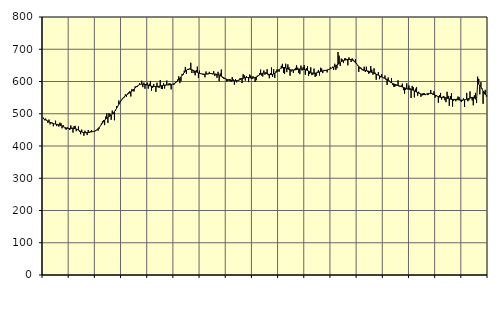
| Category | Piggar | Series 1 |
|---|---|---|
| nan | 487.8 | 483.77 |
| 87.0 | 479.9 | 482.5 |
| 87.0 | 484.9 | 480.74 |
| 87.0 | 479.7 | 478.95 |
| 87.0 | 471.6 | 477.12 |
| 87.0 | 481.9 | 475.35 |
| 87.0 | 467.1 | 473.54 |
| 87.0 | 474.1 | 471.96 |
| 87.0 | 472.4 | 470.56 |
| 87.0 | 461.1 | 469.45 |
| 87.0 | 468.9 | 468.63 |
| 87.0 | 478.5 | 467.98 |
| nan | 461.8 | 467.37 |
| 88.0 | 464.8 | 466.69 |
| 88.0 | 460.1 | 465.79 |
| 88.0 | 472.4 | 464.59 |
| 88.0 | 470.7 | 463.21 |
| 88.0 | 454.8 | 461.67 |
| 88.0 | 465.1 | 460 |
| 88.0 | 458.6 | 458.4 |
| 88.0 | 451.8 | 456.98 |
| 88.0 | 451.5 | 455.83 |
| 88.0 | 457.6 | 455.02 |
| 88.0 | 452.9 | 454.59 |
| nan | 449.6 | 454.45 |
| 89.0 | 463.9 | 454.56 |
| 89.0 | 457 | 454.75 |
| 89.0 | 441.5 | 454.8 |
| 89.0 | 461.3 | 454.48 |
| 89.0 | 462.5 | 453.77 |
| 89.0 | 445.8 | 452.63 |
| 89.0 | 449.8 | 451.09 |
| 89.0 | 460.6 | 449.28 |
| 89.0 | 444.2 | 447.36 |
| 89.0 | 436.6 | 445.49 |
| 89.0 | 450.9 | 443.82 |
| nan | 441.8 | 442.53 |
| 90.0 | 431.7 | 441.68 |
| 90.0 | 447.4 | 441.26 |
| 90.0 | 442 | 441.31 |
| 90.0 | 433.9 | 441.71 |
| 90.0 | 449.6 | 442.27 |
| 90.0 | 441 | 442.86 |
| 90.0 | 445.4 | 443.41 |
| 90.0 | 449.2 | 443.88 |
| 90.0 | 443.3 | 444.45 |
| 90.0 | 444.7 | 445.29 |
| 90.0 | 445.3 | 446.47 |
| nan | 446.8 | 448.2 |
| 91.0 | 451.3 | 450.61 |
| 91.0 | 447.6 | 453.69 |
| 91.0 | 453.5 | 457.44 |
| 91.0 | 461.6 | 461.73 |
| 91.0 | 470.1 | 466.32 |
| 91.0 | 476.5 | 471.04 |
| 91.0 | 479.9 | 475.7 |
| 91.0 | 464.7 | 479.96 |
| 91.0 | 491.2 | 483.64 |
| 91.0 | 501.6 | 486.65 |
| 91.0 | 471.5 | 489.08 |
| nan | 502.3 | 491.18 |
| 92.0 | 499.1 | 493.25 |
| 92.0 | 481.2 | 495.6 |
| 92.0 | 509.7 | 498.53 |
| 92.0 | 500 | 502.13 |
| 92.0 | 479.8 | 506.47 |
| 92.0 | 508.6 | 511.49 |
| 92.0 | 523.9 | 517.05 |
| 92.0 | 522.5 | 522.94 |
| 92.0 | 541.2 | 528.98 |
| 92.0 | 533.6 | 534.78 |
| 92.0 | 538.9 | 540.17 |
| nan | 546.3 | 545.03 |
| 93.0 | 548.2 | 549.17 |
| 93.0 | 550.4 | 552.62 |
| 93.0 | 560.4 | 555.52 |
| 93.0 | 552.9 | 558 |
| 93.0 | 562.6 | 560.32 |
| 93.0 | 566.1 | 562.69 |
| 93.0 | 570.2 | 565.06 |
| 93.0 | 553.6 | 567.57 |
| 93.0 | 576.8 | 570.29 |
| 93.0 | 570.1 | 573.28 |
| 93.0 | 569.1 | 576.55 |
| nan | 584.6 | 579.88 |
| 94.0 | 585.2 | 583.12 |
| 94.0 | 583.2 | 586.07 |
| 94.0 | 589.1 | 588.45 |
| 94.0 | 594.7 | 590.23 |
| 94.0 | 592.2 | 591.41 |
| 94.0 | 602.4 | 591.94 |
| 94.0 | 582.6 | 591.91 |
| 94.0 | 596.7 | 591.52 |
| 94.0 | 577.6 | 590.89 |
| 94.0 | 591.8 | 590.05 |
| 94.0 | 596.8 | 589.17 |
| nan | 577.9 | 588.19 |
| 95.0 | 593.1 | 587.18 |
| 95.0 | 601.7 | 586.29 |
| 95.0 | 571.4 | 585.54 |
| 95.0 | 580.4 | 584.97 |
| 95.0 | 592.4 | 584.59 |
| 95.0 | 585.3 | 584.33 |
| 95.0 | 567.8 | 584.21 |
| 95.0 | 596.1 | 584.31 |
| 95.0 | 581.7 | 584.6 |
| 95.0 | 580.4 | 585.19 |
| 95.0 | 604.4 | 585.94 |
| nan | 577.6 | 586.8 |
| 96.0 | 576.4 | 587.66 |
| 96.0 | 595.5 | 588.36 |
| 96.0 | 578.3 | 588.86 |
| 96.0 | 587.6 | 589.2 |
| 96.0 | 603 | 589.32 |
| 96.0 | 589.7 | 589.35 |
| 96.0 | 594.2 | 589.56 |
| 96.0 | 594.2 | 589.97 |
| 96.0 | 575.7 | 590.56 |
| 96.0 | 591.7 | 591.4 |
| 96.0 | 590.3 | 592.46 |
| nan | 591.2 | 593.89 |
| 97.0 | 598.8 | 595.94 |
| 97.0 | 601.2 | 598.66 |
| 97.0 | 606.6 | 601.98 |
| 97.0 | 616 | 605.74 |
| 97.0 | 594.9 | 609.84 |
| 97.0 | 601.8 | 614.15 |
| 97.0 | 623.5 | 618.65 |
| 97.0 | 620.9 | 623.22 |
| 97.0 | 633.5 | 627.66 |
| 97.0 | 645.2 | 631.62 |
| 97.0 | 623.3 | 634.84 |
| nan | 638.9 | 637.13 |
| 98.0 | 635.9 | 638.35 |
| 98.0 | 639.9 | 638.52 |
| 98.0 | 658.1 | 637.79 |
| 98.0 | 626.3 | 636.42 |
| 98.0 | 635.9 | 634.76 |
| 98.0 | 625.9 | 633.05 |
| 98.0 | 619 | 631.33 |
| 98.0 | 635 | 629.65 |
| 98.0 | 646.1 | 628.06 |
| 98.0 | 610.9 | 626.59 |
| 98.0 | 633.9 | 625.33 |
| nan | 625.4 | 624.4 |
| 99.0 | 624.3 | 623.68 |
| 99.0 | 621 | 623.19 |
| 99.0 | 620.3 | 622.88 |
| 99.0 | 612.9 | 622.84 |
| 99.0 | 631.2 | 623.08 |
| 99.0 | 622.6 | 623.6 |
| 99.0 | 622.5 | 624.24 |
| 99.0 | 629.9 | 624.68 |
| 99.0 | 626.2 | 624.77 |
| 99.0 | 623.1 | 624.55 |
| 99.0 | 622.5 | 624.13 |
| nan | 632 | 623.51 |
| 0.0 | 616.8 | 622.81 |
| 0.0 | 624.3 | 622.08 |
| 0.0 | 611.4 | 621.3 |
| 0.0 | 630 | 620.38 |
| 0.0 | 600.9 | 619.28 |
| 0.0 | 624.9 | 617.85 |
| 0.0 | 637 | 616.13 |
| 0.0 | 611.2 | 614.22 |
| 0.0 | 609.1 | 612.2 |
| 0.0 | 607.8 | 610.22 |
| 0.0 | 607.5 | 608.38 |
| nan | 599.5 | 606.74 |
| 1.0 | 601.9 | 605.35 |
| 1.0 | 607 | 604.25 |
| 1.0 | 607.6 | 603.51 |
| 1.0 | 598.8 | 603.03 |
| 1.0 | 613.9 | 602.68 |
| 1.0 | 606.6 | 602.49 |
| 1.0 | 589.9 | 602.34 |
| 1.0 | 607.6 | 602.33 |
| 1.0 | 597.4 | 602.7 |
| 1.0 | 601.4 | 603.43 |
| 1.0 | 603 | 604.46 |
| nan | 609.6 | 605.76 |
| 2.0 | 610.1 | 607.2 |
| 2.0 | 595.1 | 608.64 |
| 2.0 | 622.9 | 609.98 |
| 2.0 | 619.3 | 611.16 |
| 2.0 | 602.8 | 612.03 |
| 2.0 | 617.1 | 612.47 |
| 2.0 | 611.8 | 612.49 |
| 2.0 | 598.1 | 612.12 |
| 2.0 | 621.5 | 611.52 |
| 2.0 | 618.3 | 610.99 |
| 2.0 | 607.4 | 610.69 |
| nan | 616.5 | 610.78 |
| 3.0 | 612.3 | 611.34 |
| 3.0 | 598.7 | 612.38 |
| 3.0 | 604 | 613.89 |
| 3.0 | 617.9 | 615.79 |
| 3.0 | 620.1 | 618.02 |
| 3.0 | 625.4 | 620.41 |
| 3.0 | 637 | 622.72 |
| 3.0 | 618.4 | 624.61 |
| 3.0 | 615.6 | 625.91 |
| 3.0 | 634.3 | 626.41 |
| 3.0 | 621.2 | 626.11 |
| nan | 629.1 | 625.22 |
| 4.0 | 638.1 | 624.02 |
| 4.0 | 619.6 | 622.85 |
| 4.0 | 610 | 621.95 |
| 4.0 | 625.2 | 621.41 |
| 4.0 | 643.5 | 621.43 |
| 4.0 | 614.7 | 622.13 |
| 4.0 | 638.1 | 623.46 |
| 4.0 | 611.1 | 625.48 |
| 4.0 | 631.5 | 628.08 |
| 4.0 | 637.6 | 630.98 |
| 4.0 | 631.4 | 634.01 |
| nan | 630.4 | 636.94 |
| 5.0 | 639.9 | 639.48 |
| 5.0 | 648.6 | 641.48 |
| 5.0 | 654.8 | 642.82 |
| 5.0 | 626.5 | 643.39 |
| 5.0 | 623.7 | 643.08 |
| 5.0 | 655.2 | 642.04 |
| 5.0 | 629.2 | 640.56 |
| 5.0 | 653 | 638.99 |
| 5.0 | 644.1 | 637.58 |
| 5.0 | 617.8 | 636.44 |
| 5.0 | 631.1 | 635.66 |
| nan | 636.8 | 635.27 |
| 6.0 | 627 | 635.31 |
| 6.0 | 638.1 | 635.68 |
| 6.0 | 642.2 | 636.21 |
| 6.0 | 650.3 | 636.93 |
| 6.0 | 642.6 | 637.79 |
| 6.0 | 626.4 | 638.47 |
| 6.0 | 622.7 | 638.87 |
| 6.0 | 649.4 | 638.99 |
| 6.0 | 634.1 | 638.69 |
| 6.0 | 644.5 | 638.16 |
| 6.0 | 650.5 | 637.5 |
| nan | 621 | 636.62 |
| 7.0 | 640.9 | 635.42 |
| 7.0 | 647 | 633.97 |
| 7.0 | 616.8 | 632.2 |
| 7.0 | 623.4 | 630.21 |
| 7.0 | 644 | 628.27 |
| 7.0 | 619.8 | 626.73 |
| 7.0 | 621.6 | 625.8 |
| 7.0 | 639.9 | 625.49 |
| 7.0 | 614.4 | 625.73 |
| 7.0 | 616.8 | 626.45 |
| 7.0 | 630.3 | 627.45 |
| nan | 635.8 | 628.59 |
| 8.0 | 618.6 | 629.79 |
| 8.0 | 642.6 | 630.85 |
| 8.0 | 640.2 | 631.81 |
| 8.0 | 626.1 | 632.69 |
| 8.0 | 636 | 633.41 |
| 8.0 | 633.5 | 634.05 |
| 8.0 | 633.6 | 634.78 |
| 8.0 | 628.2 | 635.61 |
| 8.0 | 638.4 | 636.65 |
| 8.0 | 638.4 | 637.97 |
| 8.0 | 643.8 | 639.48 |
| nan | 641.5 | 641.14 |
| 9.0 | 645.8 | 642.93 |
| 9.0 | 635.7 | 644.82 |
| 9.0 | 655 | 646.75 |
| 9.0 | 636.1 | 648.9 |
| 9.0 | 640.9 | 651.27 |
| 9.0 | 691.4 | 653.77 |
| 9.0 | 680 | 656.35 |
| 9.0 | 648.4 | 658.89 |
| 9.0 | 671 | 661.24 |
| 9.0 | 668.3 | 663.25 |
| 9.0 | 657.1 | 664.84 |
| nan | 671.8 | 666.02 |
| 10.0 | 671.5 | 666.86 |
| 10.0 | 669.4 | 667.55 |
| 10.0 | 650.1 | 668.09 |
| 10.0 | 674.6 | 668.37 |
| 10.0 | 670.2 | 668.32 |
| 10.0 | 660.5 | 667.8 |
| 10.0 | 671.4 | 666.57 |
| 10.0 | 667.7 | 664.6 |
| 10.0 | 664.1 | 661.84 |
| 10.0 | 669.4 | 658.39 |
| 10.0 | 657.7 | 654.55 |
| nan | 649.3 | 650.63 |
| 11.0 | 629.8 | 646.86 |
| 11.0 | 640 | 643.45 |
| 11.0 | 642.8 | 640.61 |
| 11.0 | 636.1 | 638.35 |
| 11.0 | 633.6 | 636.56 |
| 11.0 | 645.9 | 635.3 |
| 11.0 | 629.5 | 634.44 |
| 11.0 | 645.8 | 633.69 |
| 11.0 | 630.7 | 632.93 |
| 11.0 | 624.6 | 632.05 |
| 11.0 | 625.8 | 630.95 |
| nan | 648.1 | 629.7 |
| 12.0 | 636.5 | 628.39 |
| 12.0 | 621.2 | 627.01 |
| 12.0 | 641 | 625.55 |
| 12.0 | 627.6 | 624.1 |
| 12.0 | 605.4 | 622.64 |
| 12.0 | 621.9 | 621.11 |
| 12.0 | 629.2 | 619.48 |
| 12.0 | 607.2 | 617.76 |
| 12.0 | 612.8 | 615.98 |
| 12.0 | 622.8 | 614.33 |
| 12.0 | 612.8 | 612.85 |
| nan | 610.2 | 611.42 |
| 13.0 | 618.7 | 609.88 |
| 13.0 | 605.2 | 608.03 |
| 13.0 | 589.4 | 605.85 |
| 13.0 | 612.5 | 603.41 |
| 13.0 | 602.9 | 600.9 |
| 13.0 | 597.4 | 598.43 |
| 13.0 | 610.5 | 596.1 |
| 13.0 | 590 | 594.14 |
| 13.0 | 584.3 | 592.63 |
| 13.0 | 583.3 | 591.35 |
| 13.0 | 586.4 | 590.16 |
| nan | 587.9 | 588.97 |
| 14.0 | 603.7 | 587.71 |
| 14.0 | 584.6 | 586.53 |
| 14.0 | 584.2 | 585.42 |
| 14.0 | 588 | 584.25 |
| 14.0 | 593.4 | 583.02 |
| 14.0 | 573.3 | 581.74 |
| 14.0 | 562.3 | 580.37 |
| 14.0 | 573.7 | 579.06 |
| 14.0 | 594.3 | 577.95 |
| 14.0 | 575.5 | 577.09 |
| 14.0 | 587.4 | 576.42 |
| nan | 579.7 | 575.81 |
| 15.0 | 548.7 | 575.04 |
| 15.0 | 586.4 | 573.96 |
| 15.0 | 582.3 | 572.59 |
| 15.0 | 550.7 | 570.93 |
| 15.0 | 577.6 | 569.08 |
| 15.0 | 582 | 567.2 |
| 15.0 | 555.7 | 565.49 |
| 15.0 | 568.4 | 563.91 |
| 15.0 | 561.2 | 562.41 |
| 15.0 | 552.5 | 561.08 |
| 15.0 | 556.5 | 560.06 |
| nan | 564.2 | 559.52 |
| 16.0 | 563.9 | 559.55 |
| 16.0 | 557.7 | 560.11 |
| 16.0 | 560.9 | 561 |
| 16.0 | 557.9 | 562.03 |
| 16.0 | 559.1 | 562.89 |
| 16.0 | 563 | 563.25 |
| 16.0 | 573.6 | 563.05 |
| 16.0 | 564.6 | 562.31 |
| 16.0 | 558.9 | 561.11 |
| 16.0 | 569.6 | 559.66 |
| 16.0 | 550 | 557.99 |
| nan | 557.9 | 556.16 |
| 17.0 | 553.1 | 554.42 |
| 17.0 | 534.2 | 552.94 |
| 17.0 | 558 | 551.72 |
| 17.0 | 564.5 | 550.91 |
| 17.0 | 543.8 | 550.51 |
| 17.0 | 552.9 | 550.34 |
| 17.0 | 555.2 | 550.2 |
| 17.0 | 541.9 | 549.9 |
| 17.0 | 535.9 | 549.33 |
| 17.0 | 568 | 548.45 |
| 17.0 | 555.5 | 547.35 |
| nan | 524.6 | 546.28 |
| 18.0 | 555.1 | 545.39 |
| 18.0 | 563.9 | 544.74 |
| 18.0 | 522.3 | 544.42 |
| 18.0 | 540.1 | 544.28 |
| 18.0 | 546 | 544.14 |
| 18.0 | 538.8 | 543.99 |
| 18.0 | 546.6 | 543.81 |
| 18.0 | 553.4 | 543.51 |
| 18.0 | 551.7 | 543.13 |
| 18.0 | 541.1 | 542.75 |
| 18.0 | 536.5 | 542.52 |
| nan | 540.3 | 542.56 |
| 19.0 | 547.6 | 542.82 |
| 19.0 | 521.2 | 543.27 |
| 19.0 | 544.6 | 543.94 |
| 19.0 | 564.5 | 544.89 |
| 19.0 | 538.8 | 546.15 |
| 19.0 | 541.8 | 547.55 |
| 19.0 | 569.3 | 548.89 |
| 19.0 | 547.8 | 550.04 |
| 19.0 | 541.2 | 550.67 |
| 19.0 | 526.3 | 550.4 |
| 19.0 | 557 | 548.97 |
| nan | 564.7 | 546.24 |
| 20.0 | 533.2 | 542.11 |
| 20.0 | 615.1 | 593.98 |
| 20.0 | 608.1 | 592.7 |
| 20.0 | 560.2 | 585.58 |
| 20.0 | 597.9 | 583.98 |
| 20.0 | 578.3 | 576.71 |
| 20.0 | 530.8 | 570.02 |
| 20.0 | 568.3 | 564.21 |
| 20.0 | 574.1 | 559.64 |
| 20.0 | 553.8 | 556.35 |
| 20.0 | 554 | 554.07 |